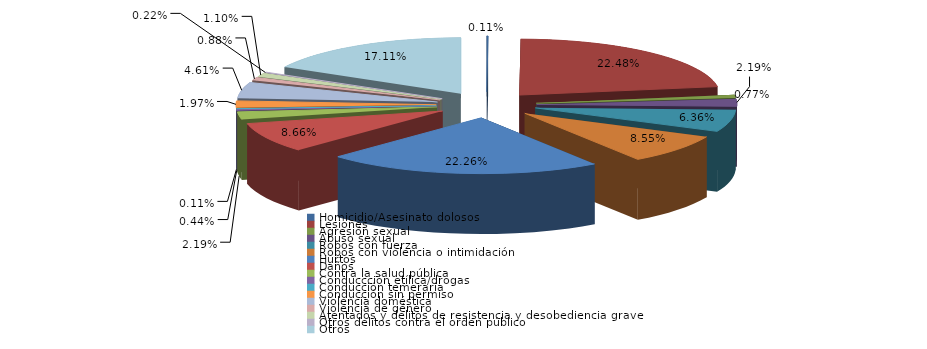
| Category | Series 0 |
|---|---|
| Homicidio/Asesinato dolosos | 1 |
| Lesiones | 205 |
| Agresión sexual | 7 |
| Abuso sexual | 20 |
| Robos con fuerza | 58 |
| Robos con violencia o intimidación | 78 |
| Hurtos | 203 |
| Daños | 79 |
| Contra la salud pública | 20 |
| Conduccción etílica/drogas | 4 |
| Conducción temeraria | 1 |
| Conducción sin permiso | 18 |
| Violencia doméstica | 42 |
| Violencia de género | 8 |
| Atentados y delitos de resistencia y desobediencia grave | 10 |
| Otros delitos contra el orden público | 2 |
| Otros | 156 |